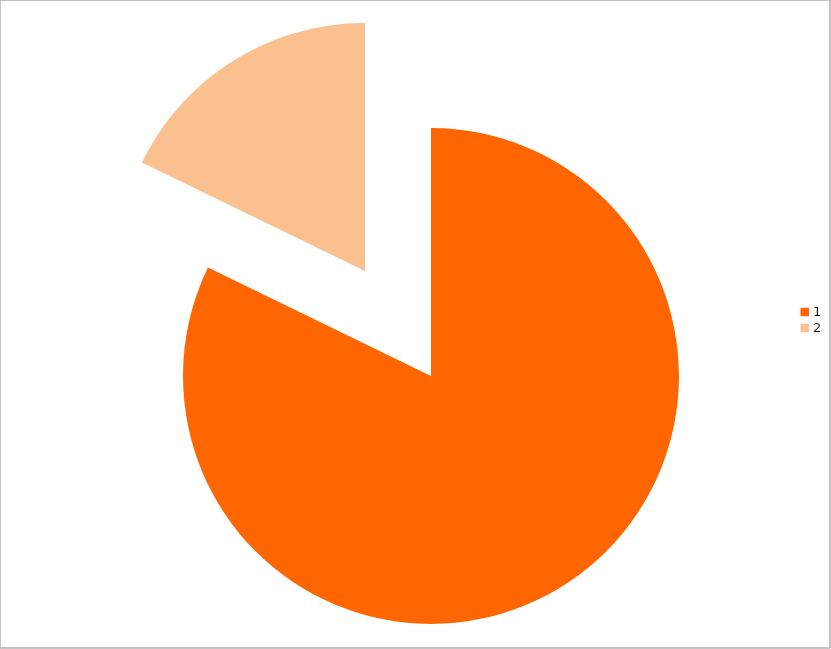
| Category | Series 0 |
|---|---|
| 0 | 545 |
| 1 | 118 |